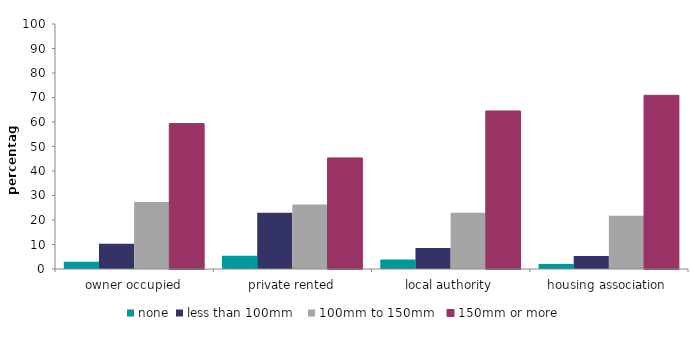
| Category | none | less than 100mm | 100mm to 150mm | 150mm or more |
|---|---|---|---|---|
| owner occupied | 2.98 | 10.296 | 27.359 | 59.365 |
| private rented | 5.445 | 22.924 | 26.298 | 45.333 |
| local authority | 3.92 | 8.619 | 22.955 | 64.506 |
| housing association | 2.051 | 5.29 | 21.75 | 70.909 |